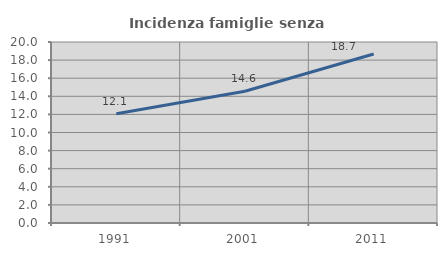
| Category | Incidenza famiglie senza nuclei |
|---|---|
| 1991.0 | 12.081 |
| 2001.0 | 14.556 |
| 2011.0 | 18.679 |